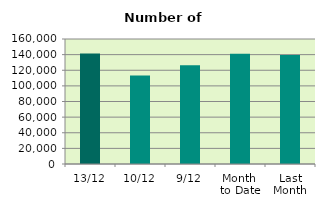
| Category | Series 0 |
|---|---|
| 13/12 | 141498 |
| 10/12 | 113244 |
| 9/12 | 126272 |
| Month 
to Date | 141062.444 |
| Last
Month | 139642.182 |